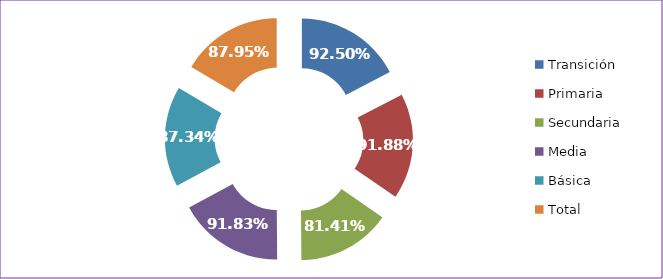
| Category | Tasa Aprobación |
|---|---|
| Transición | 0.925 |
| Primaria | 0.919 |
| Secundaria | 0.814 |
| Media | 0.918 |
| Básica | 0.873 |
| Total | 0.88 |